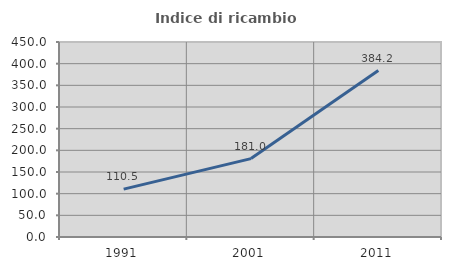
| Category | Indice di ricambio occupazionale  |
|---|---|
| 1991.0 | 110.526 |
| 2001.0 | 180.952 |
| 2011.0 | 384.211 |